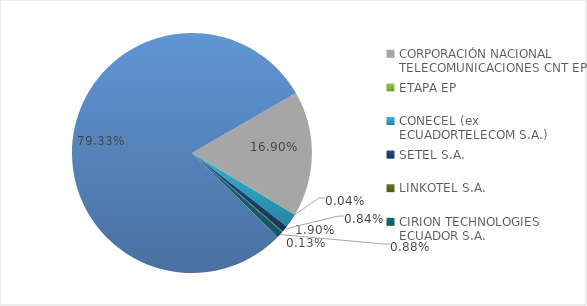
| Category | CODIGO DE AREA 2 |
|---|---|
| CORPORACIÓN NACIONAL TELECOMUNICACIONES CNT EP | 0.169 |
| ETAPA EP | 0 |
| CONECEL (ex ECUADORTELECOM S.A.) | 0.019 |
| SETEL S.A. | 0.008 |
| LINKOTEL S.A. | 0.001 |
| CIRION TECHNOLOGIES ECUADOR S.A. | 0.009 |
| DISPONIBLE | 0.793 |